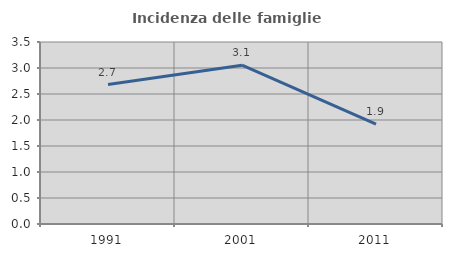
| Category | Incidenza delle famiglie numerose |
|---|---|
| 1991.0 | 2.681 |
| 2001.0 | 3.053 |
| 2011.0 | 1.918 |